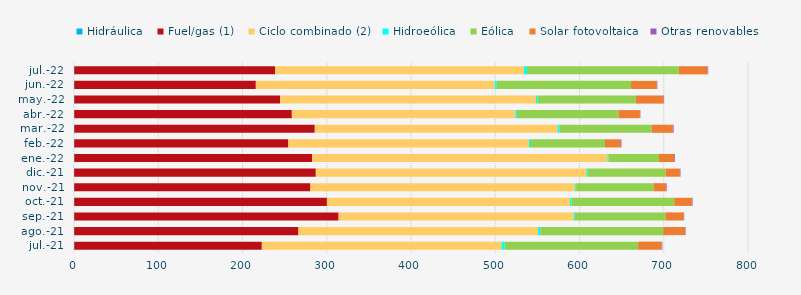
| Category | Hidráulica | Fuel/gas (1) | Ciclo combinado (2) | Hidroeólica | Eólica | Solar fotovoltaica | Otras renovables |
|---|---|---|---|---|---|---|---|
| jul.-21 | 0.29 | 222.639 | 284.61 | 3.578 | 158.516 | 27.938 | 0.734 |
| ago.-21 | 0.281 | 266.149 | 284.301 | 2.663 | 145.95 | 26.121 | 0.57 |
| sep.-21 | 0.278 | 313.815 | 278.888 | 1.42 | 107.853 | 21.565 | 0.4 |
| oct.-21 | 0.282 | 299.917 | 288.429 | 1.853 | 121.987 | 20.979 | 0.756 |
| nov.-21 | 0.231 | 280.341 | 314.273 | 1.14 | 91.77 | 14.946 | 0.753 |
| dic.-21 | 0.155 | 286.856 | 321.013 | 1.228 | 92.868 | 16.937 | 0.822 |
| ene.-22 | 0.294 | 282.523 | 350.314 | 1.111 | 60.148 | 17.957 | 0.861 |
| feb.-22 | 0.251 | 254.215 | 285.333 | 1.482 | 88.982 | 18.799 | 0.721 |
| mar.-22 | 0.296 | 285.489 | 288.518 | 2.126 | 109.436 | 24.968 | 0.91 |
| abr.-22 | 0.274 | 258.292 | 265.373 | 1.753 | 120.763 | 25.165 | 0.614 |
| may.-22 | 0.299 | 244.426 | 303.457 | 1.917 | 116.793 | 32.833 | 0.721 |
| jun.-22 | 0.281 | 215.547 | 283.584 | 2.45 | 159.317 | 30.519 | 0.696 |
| jul.-22 | 0.294 | 238.325 | 295.517 | 3.563 | 180.243 | 34.108 | 0.688 |